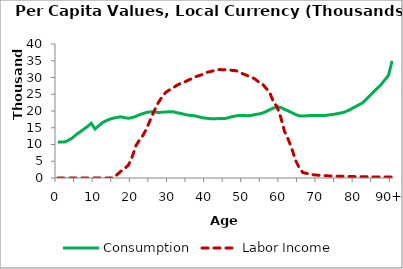
| Category | Consumption | Labor Income |
|---|---|---|
| 0 | 10689.914 | 0 |
|  | 10772.507 | 0 |
| 2 | 10789.375 | 0 |
| 3 | 11386.677 | 0 |
| 4 | 12023.36 | 0 |
| 5 | 13016.232 | 0 |
| 6 | 13784.117 | 0 |
| 7 | 14587.966 | 0 |
| 8 | 15416.324 | 0 |
| 9 | 16331.814 | 0 |
| 10 | 14628.865 | 0 |
| 11 | 15558.155 | 0 |
| 12 | 16523.778 | 0 |
| 13 | 17078.724 | 0 |
| 14 | 17558.882 | 0 |
| 15 | 17884.928 | 0 |
| 16 | 18084.279 | 1053.858 |
| 17 | 18275.964 | 2041.744 |
| 18 | 17985.943 | 2843.377 |
| 19 | 17854.502 | 3864.516 |
| 20 | 18024.28 | 6291.418 |
| 21 | 18399.441 | 9632.563 |
| 22 | 18901.008 | 11362.961 |
| 23 | 19271.617 | 12869.453 |
| 24 | 19595.93 | 15053.961 |
| 25 | 19749.664 | 17647.321 |
| 26 | 19792.845 | 20173.917 |
| 27 | 19536.856 | 22399.819 |
| 28 | 19626.83 | 24148.514 |
| 29 | 19727.179 | 25529.447 |
| 30 | 19745.285 | 26258.417 |
| 31 | 19808.488 | 26892.204 |
| 32 | 19499.781 | 27657.668 |
| 33 | 19300.07 | 28224.906 |
| 34 | 19018.512 | 28606.121 |
| 35 | 18770.991 | 29139.076 |
| 36 | 18660.1 | 29668.232 |
| 37 | 18531.187 | 30222.403 |
| 38 | 18237.464 | 30553.868 |
| 39 | 17983.519 | 30929.965 |
| 40 | 17831.676 | 31515.973 |
| 41 | 17715.512 | 31751.744 |
| 42 | 17694.699 | 32033.145 |
| 43 | 17727.039 | 32372.515 |
| 44 | 17744.931 | 32347.343 |
| 45 | 17760.218 | 32333.005 |
| 46 | 18021.321 | 32296.41 |
| 47 | 18338.374 | 32107.269 |
| 48 | 18543.082 | 32025.297 |
| 49 | 18689.124 | 31476.194 |
| 50 | 18680.211 | 31023.047 |
| 51 | 18586.604 | 30583.968 |
| 52 | 18661.148 | 30230.23 |
| 53 | 18931.281 | 29604.664 |
| 54 | 19094.296 | 28723.587 |
| 55 | 19347.2 | 28197.389 |
| 56 | 19803.782 | 26844 |
| 57 | 20351.35 | 25647.895 |
| 58 | 20889.178 | 22800.023 |
| 59 | 21170.409 | 21322.814 |
| 60 | 21077.265 | 18127.309 |
| 61 | 20518.474 | 13983.407 |
| 62 | 20036.962 | 11600.939 |
| 63 | 19501.081 | 8756.421 |
| 64 | 18952.017 | 5264.891 |
| 65 | 18564.645 | 3029.586 |
| 66 | 18489.469 | 1593.256 |
| 67 | 18568.559 | 1373.105 |
| 68 | 18653.561 | 1154.849 |
| 69 | 18673.523 | 922.059 |
| 70 | 18679.597 | 841.788 |
| 71 | 18659.885 | 712.557 |
| 72 | 18654.282 | 699.31 |
| 73 | 18832.22 | 616.513 |
| 74 | 18974.715 | 591.28 |
| 75 | 19151.385 | 548.671 |
| 76 | 19367.732 | 525.389 |
| 77 | 19624.032 | 484.259 |
| 78 | 20067.393 | 456.821 |
| 79 | 20628.288 | 423.383 |
| 80 | 21222.634 | 416.379 |
| 81 | 21809.956 | 404.823 |
| 82 | 22422.894 | 363.452 |
| 83 | 23472.567 | 379.168 |
| 84 | 24588.725 | 355.772 |
| 85 | 25662.991 | 332.949 |
| 86 | 26768.399 | 319.089 |
| 87 | 27864.525 | 311.504 |
| 88 | 29240.591 | 293.397 |
| 89 | 30593.98 | 289.264 |
| 90+ | 34950.5 | 256.386 |